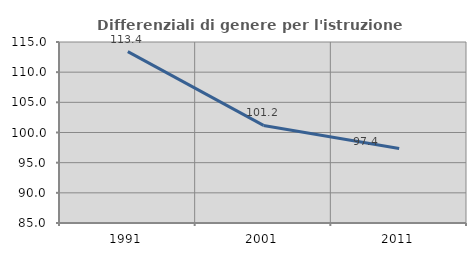
| Category | Differenziali di genere per l'istruzione superiore |
|---|---|
| 1991.0 | 113.404 |
| 2001.0 | 101.17 |
| 2011.0 | 97.353 |